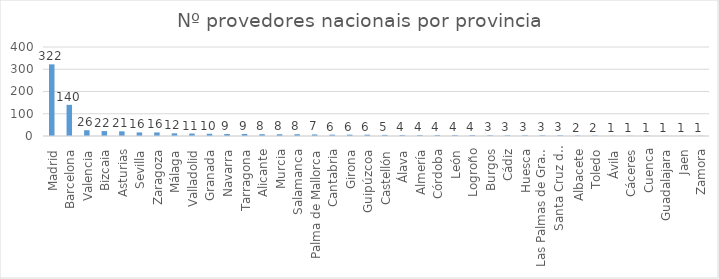
| Category | Series 0 |
|---|---|
| Madrid | 322 |
| Barcelona | 140 |
| Valencia | 26 |
| Bizcaia | 22 |
| Asturias | 21 |
| Sevilla | 16 |
| Zaragoza | 16 |
| Málaga | 12 |
| Valladolid | 11 |
| Granada | 10 |
| Navarra | 9 |
| Tarragona | 9 |
| Alicante | 8 |
| Murcia | 8 |
| Salamanca | 8 |
| Palma de Mallorca | 7 |
| Cantabria | 6 |
| Girona | 6 |
| Guipúzcoa | 6 |
| Castellón | 5 |
| Álava | 4 |
| Almería | 4 |
| Córdoba | 4 |
| León | 4 |
| Logroño | 4 |
| Burgos | 3 |
| Cádiz | 3 |
| Huesca | 3 |
| Las Palmas de Gran Canaria | 3 |
| Santa Cruz de Tenerife | 3 |
| Albacete | 2 |
| Toledo | 2 |
| Ávila | 1 |
| Cáceres | 1 |
| Cuenca | 1 |
| Guadalajara | 1 |
| Jaen | 1 |
| Zamora | 1 |